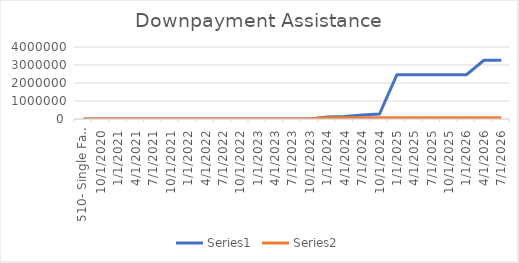
| Category | Series 0 | Series 1 |
|---|---|---|
| 510- Single Family Housing | 0 | 0 |
| 10/1/2020 | 0 | 0 |
| 1/1/2021 | 0 | 0 |
| 4/1/2021 | 0 | 0 |
| 7/1/2021 | 0 | 0 |
| 10/1/2021 | 0 | 0 |
| 1/1/2022 | 0 | 0 |
| 4/1/2022 | 0 | 0 |
| 7/1/2022 | 0 | 0 |
| 10/1/2022 | 0 | 0 |
| 1/1/2023 | 0 | 0 |
| 4/1/2023 | 0 | 0 |
| 7/1/2023 | 0 | 0 |
| 10/1/2023 | 0 | 0 |
| 1/1/2024 | 117947.74 | 65617.43 |
| 4/1/2024 | 137947.74 | 65617.43 |
| 7/1/2024 | 217947.74 | 65617.43 |
| 10/1/2024 | 277947.74 | 65617.43 |
| 1/1/2025 | 2457947.74 | 65617.43 |
| 4/1/2025 | 2457947.74 | 65617.43 |
| 7/1/2025 | 2457947.74 | 65617.43 |
| 10/1/2025 | 2457947.74 | 65617.43 |
| 1/1/2026 | 2457947.74 | 65617.43 |
| 4/1/2026 | 3257947.74 | 65617.43 |
| 7/1/2026 | 3257947.74 | 65617.43 |